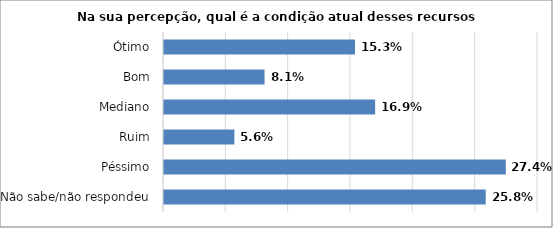
| Category | Series 0 |
|---|---|
| Não sabe/não respondeu | 0.258 |
| Péssimo | 0.274 |
| Ruim | 0.056 |
| Mediano | 0.169 |
| Bom | 0.081 |
| Ótimo | 0.153 |